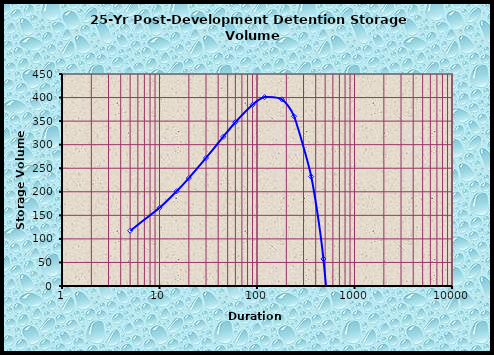
| Category | 10 Year Det. |
|---|---|
| 1440.0 | -2015.449 |
| 1200.0 | -1431.317 |
| 960.0 | -880.714 |
| 720.0 | -376.382 |
| 480.0 | 57.424 |
| 360.0 | 232.339 |
| 240.0 | 360.277 |
| 180.0 | 396.28 |
| 120.0 | 400.991 |
| 90.0 | 384.718 |
| 60.0 | 347.602 |
| 45.0 | 316.636 |
| 30.0 | 271.787 |
| 20.0 | 229.047 |
| 15.0 | 201.161 |
| 10.0 | 165.984 |
| 5.0 | 117.269 |